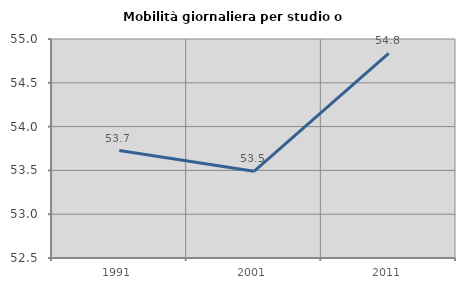
| Category | Mobilità giornaliera per studio o lavoro |
|---|---|
| 1991.0 | 53.726 |
| 2001.0 | 53.49 |
| 2011.0 | 54.836 |